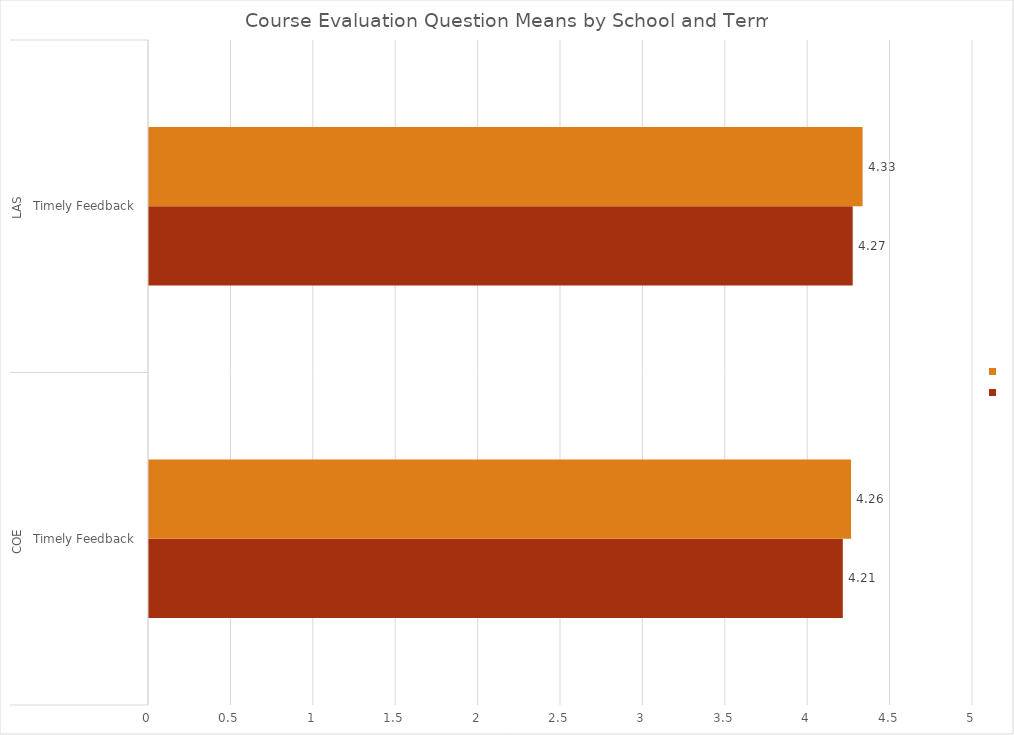
| Category | Winter 2015 | Spring 2016 |
|---|---|---|
| 0 | 4.21 | 4.26 |
| 1 | 4.27 | 4.33 |